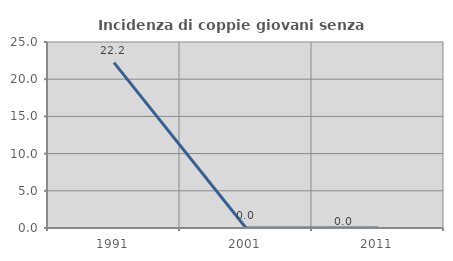
| Category | Incidenza di coppie giovani senza figli |
|---|---|
| 1991.0 | 22.222 |
| 2001.0 | 0 |
| 2011.0 | 0 |